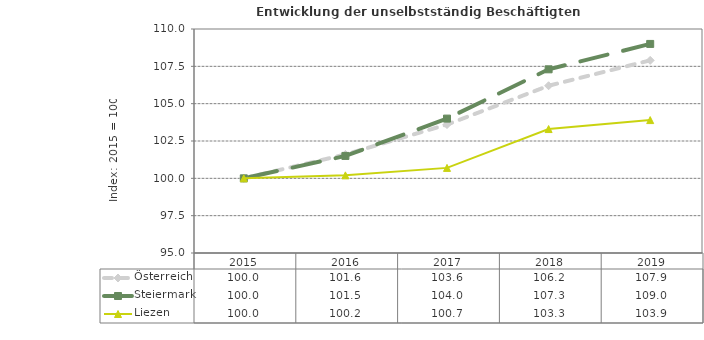
| Category | Österreich | Steiermark | Liezen |
|---|---|---|---|
| 2019.0 | 107.9 | 109 | 103.9 |
| 2018.0 | 106.2 | 107.3 | 103.3 |
| 2017.0 | 103.6 | 104 | 100.7 |
| 2016.0 | 101.6 | 101.5 | 100.2 |
| 2015.0 | 100 | 100 | 100 |